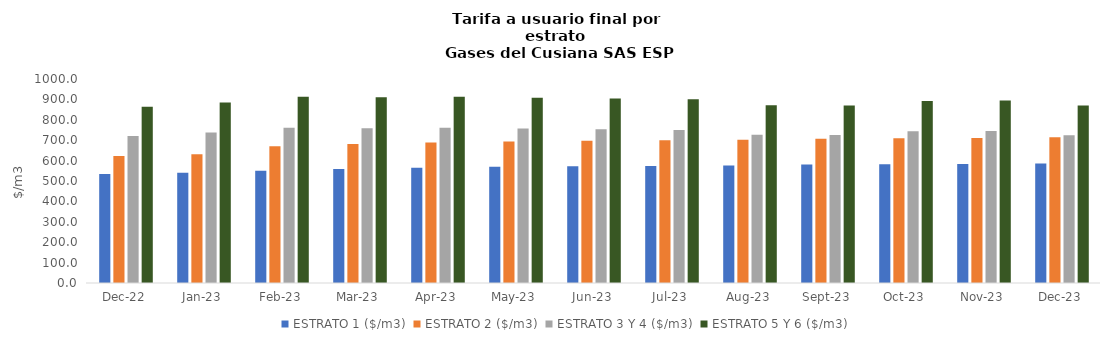
| Category | ESTRATO 1 ($/m3) | ESTRATO 2 ($/m3) | ESTRATO 3 Y 4 ($/m3) | ESTRATO 5 Y 6 ($/m3) |
|---|---|---|---|---|
| 2022-12-01 | 533.8 | 622.78 | 720.1 | 864.12 |
| 2023-01-01 | 540.64 | 630.76 | 737.34 | 884.808 |
| 2023-02-01 | 550.34 | 670.8 | 760.69 | 912.828 |
| 2023-03-01 | 559.36 | 681.79 | 758.71 | 910.452 |
| 2023-04-01 | 565.3 | 689.03 | 760.69 | 912.828 |
| 2023-05-01 | 569.53 | 694.19 | 757.13 | 908.556 |
| 2023-06-01 | 571.88 | 697.06 | 753.75 | 904.5 |
| 2023-07-01 | 573.63 | 699.2 | 750.21 | 900.252 |
| 2023-08-01 | 576.45 | 702.64 | 726.44 | 871.728 |
| 2023-09-01 | 580.51 | 707.59 | 725.31 | 870.372 |
| 2023-10-01 | 581.75 | 709.1 | 743.81 | 892.572 |
| 2023-11-01 | 583.2 | 710.87 | 745.28 | 894.336 |
| 2023-12-01 | 585.94 | 714.2 | 724.84 | 869.808 |